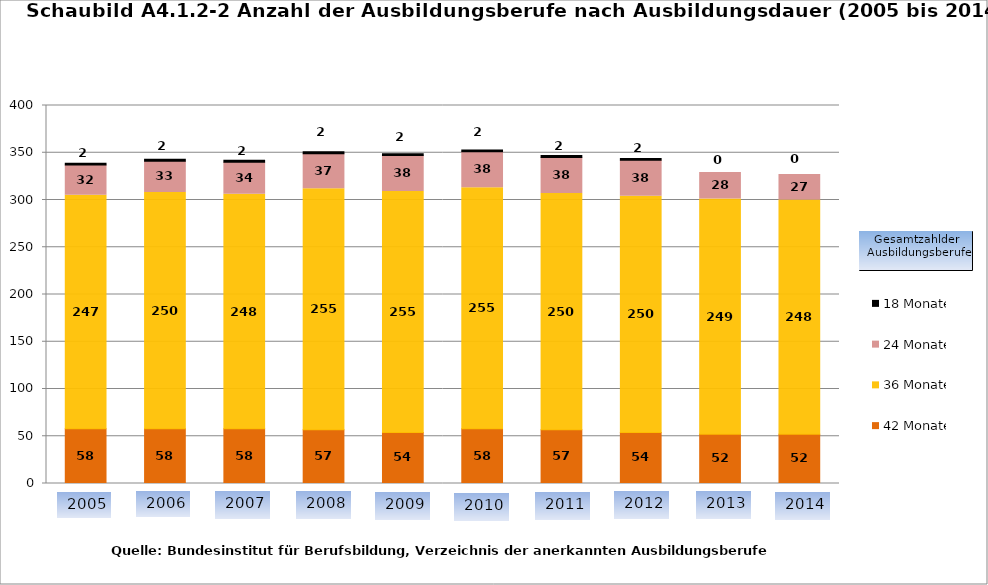
| Category | 42 Monate | 36 Monate | 24 Monate | 18 Monate |
|---|---|---|---|---|
| 0 | 58 | 247 | 32 | 2 |
| 1 | 58 | 250 | 33 | 2 |
| 2 | 58 | 248 | 34 | 2 |
| 3 | 57 | 255 | 37 | 2 |
| 4 | 54 | 255 | 38 | 2 |
| 5 | 58 | 255 | 38 | 2 |
| 6 | 57 | 250 | 38 | 2 |
| 7 | 54 | 250 | 38 | 2 |
| 8 | 52 | 249 | 28 | 0 |
| 9 | 52 | 248 | 27 | 0 |